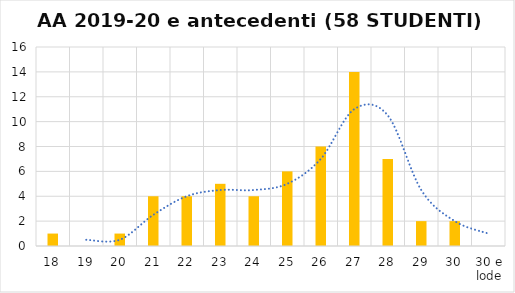
| Category | Series 0 |
|---|---|
| 18 | 1 |
| 19 | 0 |
| 20 | 1 |
| 21 | 4 |
| 22 | 4 |
| 23 | 5 |
| 24 | 4 |
| 25 | 6 |
| 26 | 8 |
| 27 | 14 |
| 28 | 7 |
| 29 | 2 |
| 30 | 2 |
| 30 e lode | 0 |